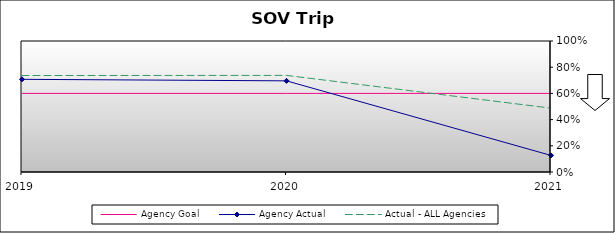
| Category | Agency Goal | Agency Actual | Actual - ALL Agencies |
|---|---|---|---|
| 2019.0 | 0.6 | 0.708 | 0.736 |
| 2020.0 | 0.6 | 0.696 | 0.737 |
| 2021.0 | 0.6 | 0.126 | 0.487 |